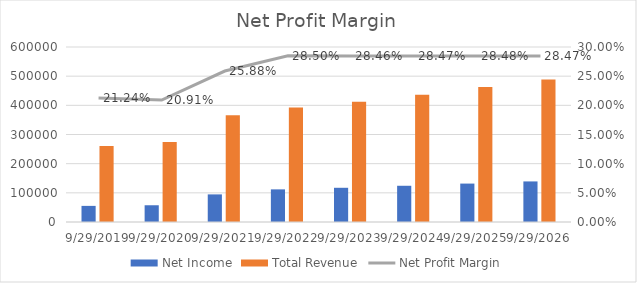
| Category | Net Income | Total Revenue |
|---|---|---|
| 9/29/2019 | 55256 | 260174 |
| 9/29/2020 | 57411 | 274515 |
| 9/29/2021 | 94680 | 365817 |
| 9/29/2022 | 111866.274 | 392521.641 |
| 9/29/2023 | 117305.039 | 412147.723 |
| 9/29/2024 | 124211.372 | 436222.814 |
| 9/29/2025 | 131734.795 | 462601.751 |
| 9/29/2026 | 139122.006 | 488643.915 |